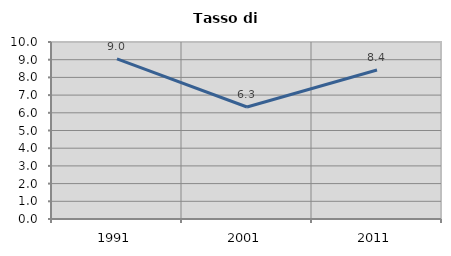
| Category | Tasso di disoccupazione   |
|---|---|
| 1991.0 | 9.049 |
| 2001.0 | 6.329 |
| 2011.0 | 8.417 |